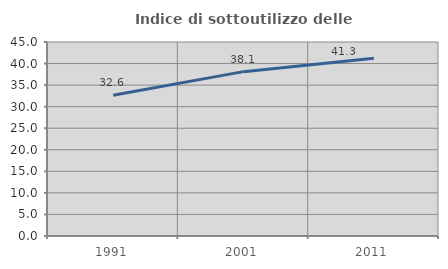
| Category | Indice di sottoutilizzo delle abitazioni  |
|---|---|
| 1991.0 | 32.628 |
| 2001.0 | 38.125 |
| 2011.0 | 41.256 |